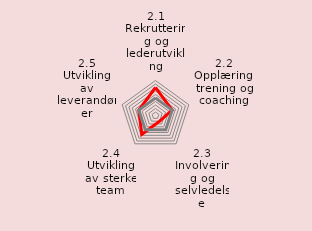
| Category | Series 0 | Series 1 |
|---|---|---|
| 2.1 Rekruttering og lederutvikling | 8 | 5 |
| 2.2 Opplæring, trening og coaching | 5 | 5 |
| 2.3 Involvering og selvledelse | 2 | 5 |
| 2.4 Utvikling av sterke team | 6.7 | 5 |
| 2.5 Utvikling av leverandører | 5 | 5 |